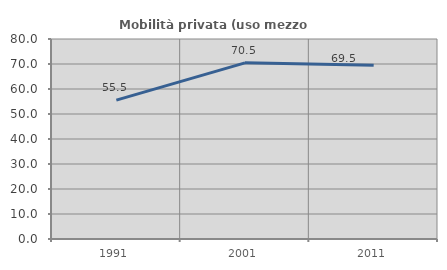
| Category | Mobilità privata (uso mezzo privato) |
|---|---|
| 1991.0 | 55.547 |
| 2001.0 | 70.468 |
| 2011.0 | 69.526 |